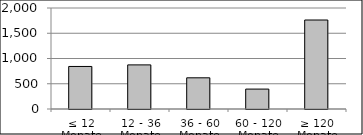
| Category | Volumen |
|---|---|
| ≤ 12 Monate | 842419464.07 |
| 12 - 36 Monate | 873669675.2 |
| 36 - 60 Monate | 617605155.26 |
| 60 - 120 Monate | 394408724.13 |
| ≥ 120 Monate | 1762313833.316 |